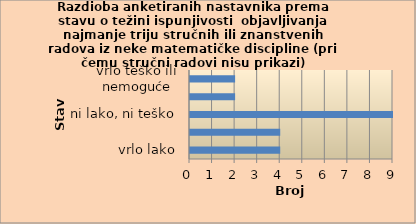
| Category | Series 0 |
|---|---|
| vrlo lako | 4 |
| lako | 4 |
| ni lako, ni teško | 9 |
| teško | 2 |
| vrlo teško ili nemoguće | 2 |